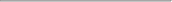
| Category | All items - 12 month rolling year average changes |
|---|---|
| Aperila - 20 | 0.02 |
| Me - 20 | 0.018 |
| Iuni - 20 | 0.015 |
| Iulai - 20 | 0.011 |
| Aukuso - 20 | 0.009 |
| Setema - 20 | 0.004 |
| Oketopa - 20 | -0.002 |
| Novema - 20 | -0.009 |
| Tesema - 20 | -0.016 |
| Ianuari - 21 | -0.024 |
| Fepuari -21 | -0.032 |
| Mati-21 | -0.038 |
| Aperila -21 | -0.039 |